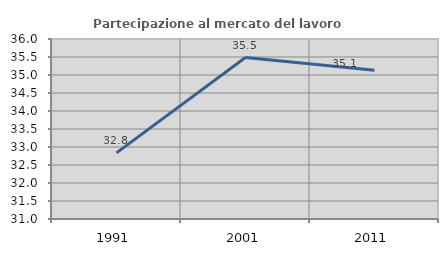
| Category | Partecipazione al mercato del lavoro  femminile |
|---|---|
| 1991.0 | 32.836 |
| 2001.0 | 35.484 |
| 2011.0 | 35.135 |